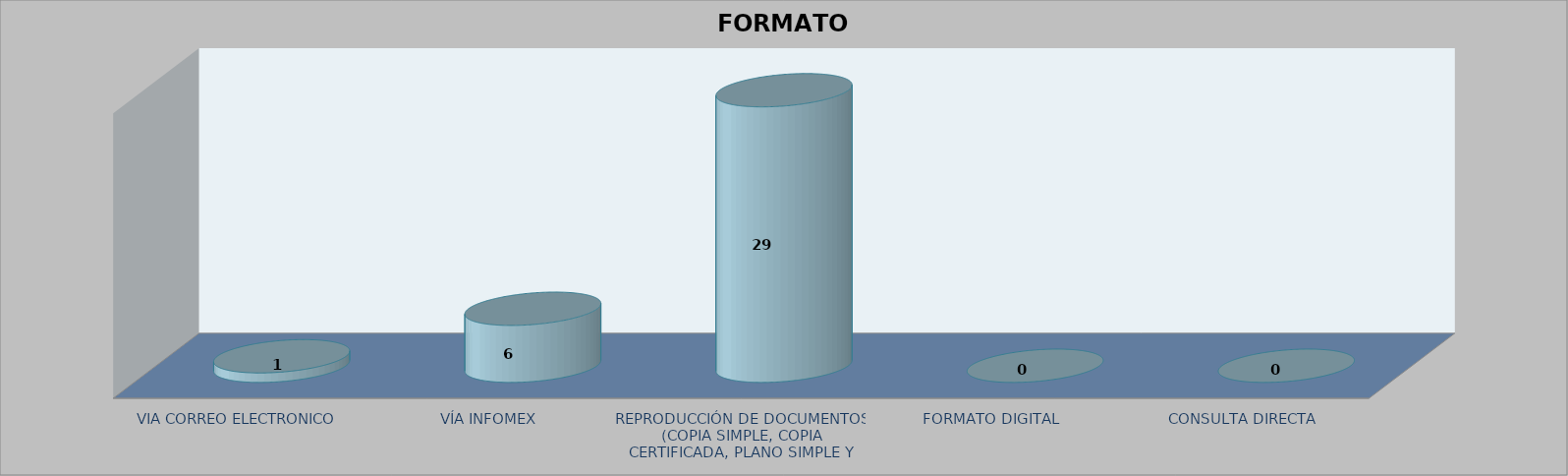
| Category |        FORMATO SOLICITADO | Series 1 | Series 2 |
|---|---|---|---|
| VIA CORREO ELECTRONICO |  |  | 1 |
| VÍA INFOMEX |  |  | 6 |
| REPRODUCCIÓN DE DOCUMENTOS (COPIA SIMPLE, COPIA CERTIFICADA, PLANO SIMPLE Y PLANO CERTIFICADO) |  |  | 29 |
| FORMATO DIGITAL |  |  | 0 |
| CONSULTA DIRECTA |  |  | 0 |